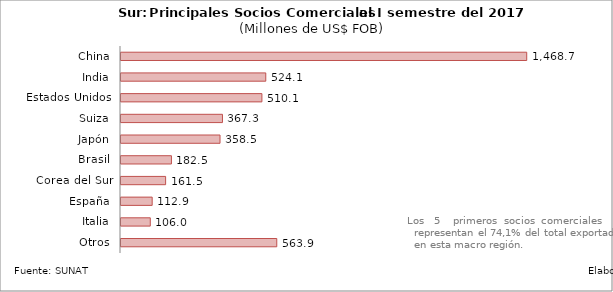
| Category | Series 0 |
|---|---|
| China | 1468.705 |
| India | 524.054 |
| Estados Unidos | 510.102 |
| Suiza | 367.289 |
| Japón | 358.466 |
| Brasil | 182.542 |
| Corea del Sur | 161.483 |
| España | 112.868 |
| Italia | 106.039 |
| Otros | 563.908 |